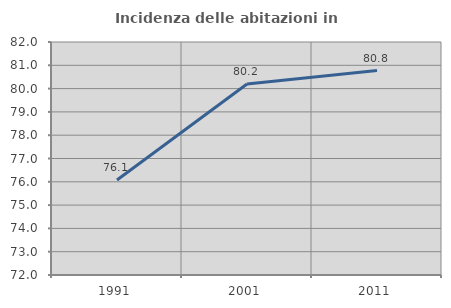
| Category | Incidenza delle abitazioni in proprietà  |
|---|---|
| 1991.0 | 76.078 |
| 2001.0 | 80.194 |
| 2011.0 | 80.777 |